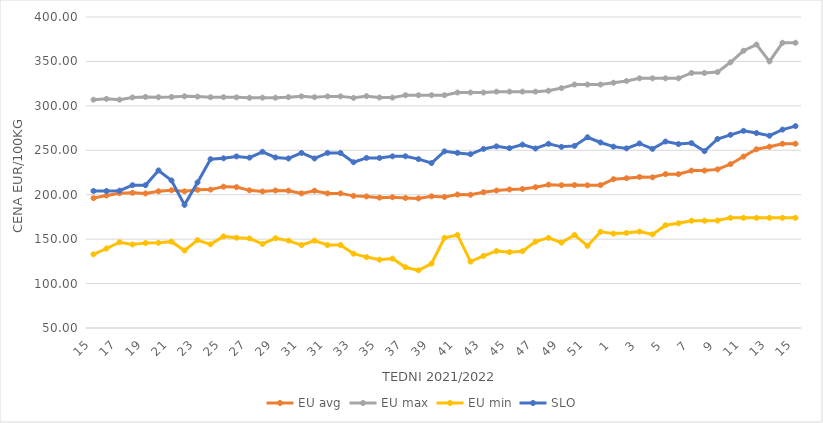
| Category | EU avg | EU max | EU min | SLO |
|---|---|---|---|---|
| 15.0 | 196.13 | 306.96 | 132.893 | 204.2 |
| 16.0 | 199.1 | 307.87 | 139.462 | 204.2 |
| 17.0 | 201.754 | 306.98 | 146.538 | 204.51 |
| 18.0 | 202.13 | 309.49 | 144.017 | 210.72 |
| 19.0 | 201.439 | 310.06 | 145.644 | 210.68 |
| 20.0 | 203.834 | 309.69 | 145.911 | 227.32 |
| 21.0 | 205.04 | 309.99 | 147.188 | 216.08 |
| 22.0 | 203.79 | 310.76 | 137.177 | 188.6 |
| 23.0 | 205.51 | 310.41 | 148.928 | 213.84 |
| 24.0 | 205.73 | 309.64 | 144.161 | 239.99 |
| 25.0 | 209.095 | 309.74 | 153.081 | 240.99 |
| 26.0 | 208.551 | 309.55 | 151.599 | 243.11 |
| 27.0 | 204.914 | 309.08 | 150.789 | 241.72 |
| 28.0 | 203.681 | 309.21 | 144.56 | 248.33 |
| 29.0 | 204.773 | 309.15 | 151.052 | 241.96 |
| 30.0 | 204.558 | 309.78 | 148.33 | 240.79 |
| 31.0 | 201.483 | 310.67 | 143.33 | 247 |
| 30.0 | 204.558 | 309.78 | 148.33 | 240.79 |
| 31.0 | 201.483 | 310.67 | 143.33 | 247 |
| 32.0 | 201.483 | 310.67 | 143.33 | 247 |
| 33.0 | 198.691 | 309 | 133.607 | 236.54 |
| 34.0 | 198.027 | 310.9 | 129.797 | 241.45 |
| 35.0 | 196.72 | 309.41 | 126.926 | 241.39 |
| 36.0 | 197.157 | 309.28 | 128.099 | 243.19 |
| 37.0 | 196.375 | 312 | 118.364 | 243.28 |
| 38.0 | 195.821 | 312 | 114.892 | 240.06 |
| 39.0 | 198.179 | 312 | 122.517 | 235.66 |
| 40.0 | 197.482 | 312 | 151.488 | 248.77 |
| 41.0 | 200.22 | 315 | 154.74 | 247.07 |
| 42.0 | 199.965 | 315 | 124.748 | 245.64 |
| 43.0 | 202.804 | 315 | 131.104 | 251.53 |
| 44.0 | 204.713 | 316 | 136.6 | 254.42 |
| 45.0 | 205.906 | 316 | 135.362 | 252.35 |
| 46.0 | 206.476 | 316 | 136.39 | 256.33 |
| 47.0 | 208.415 | 316 | 147.192 | 252.01 |
| 48.0 | 211.314 | 317 | 151.41 | 257.25 |
| 49.0 | 210.677 | 320 | 146.064 | 253.87 |
| 50.0 | 210.823 | 324 | 154.698 | 254.94 |
| 51.0 | 210.59 | 324 | 142.382 | 264.65 |
| 52.0 | 210.763 | 324 | 158.333 | 258.8 |
| 1.0 | 217.49 | 326 | 156.222 | 254.09 |
| 2.0 | 218.55 | 328 | 156.969 | 252.15 |
| 3.0 | 219.967 | 331 | 158.511 | 257.65 |
| 4.0 | 219.57 | 331 | 155.346 | 251.6 |
| 5.0 | 223.136 | 331 | 165.59 | 259.87 |
| 6.0 | 223.143 | 331 | 167.86 | 256.97 |
| 7.0 | 227.138 | 337 | 170.719 | 258.07 |
| 8.0 | 227.191 | 337 | 170.743 | 248.97 |
| 9.0 | 228.512 | 338 | 170.92 | 262.72 |
| 10.0 | 234.369 | 349 | 174 | 267.38 |
| 11.0 | 242.946 | 362 | 174 | 271.86 |
| 12.0 | 251.132 | 369 | 174 | 269.43 |
| 13.0 | 254.061 | 350 | 174 | 266.39 |
| 14.0 | 257.367 | 371 | 174 | 273.3 |
| 15.0 | 257.367 | 371 | 174 | 277.18 |